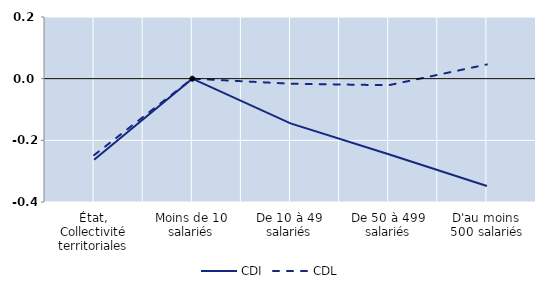
| Category | CDI | CDL |
|---|---|---|
| État, Collectivité territoriales | -0.263 | -0.248 |
| Moins de 10 salariés | 0 | 0 |
| De 10 à 49 salariés | -0.145 | -0.016 |
| De 50 à 499 salariés | -0.245 | -0.021 |
| D'au moins 500 salariés | -0.348 | 0.046 |